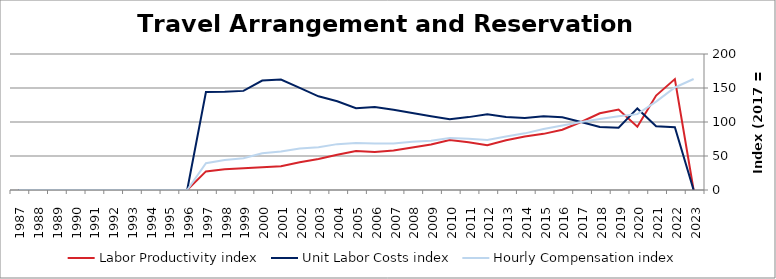
| Category | Labor Productivity index | Unit Labor Costs index | Hourly Compensation index |
|---|---|---|---|
| 2023.0 | 0 | 0 | 163.231 |
| 2022.0 | 163.071 | 92.446 | 150.753 |
| 2021.0 | 138.811 | 93.658 | 130.007 |
| 2020.0 | 92.969 | 119.975 | 111.539 |
| 2019.0 | 118.233 | 91.633 | 108.34 |
| 2018.0 | 112.78 | 92.608 | 104.444 |
| 2017.0 | 100 | 100 | 100 |
| 2016.0 | 88.666 | 106.846 | 94.735 |
| 2015.0 | 82.556 | 108.479 | 89.556 |
| 2014.0 | 78.749 | 105.789 | 83.308 |
| 2013.0 | 73.19 | 107.402 | 78.608 |
| 2012.0 | 65.942 | 111.278 | 73.379 |
| 2011.0 | 70.225 | 107.181 | 75.268 |
| 2010.0 | 73.42 | 104.143 | 76.462 |
| 2009.0 | 66.896 | 108.481 | 72.57 |
| 2008.0 | 62.524 | 113.28 | 70.826 |
| 2007.0 | 58.157 | 117.896 | 68.565 |
| 2006.0 | 56.029 | 122.043 | 68.379 |
| 2005.0 | 57.455 | 120.292 | 69.114 |
| 2004.0 | 51.716 | 130.444 | 67.46 |
| 2003.0 | 45.706 | 137.761 | 62.964 |
| 2002.0 | 40.72 | 150.277 | 61.193 |
| 2001.0 | 34.818 | 162.473 | 56.569 |
| 2000.0 | 33.495 | 160.895 | 53.892 |
| 1999.0 | 32.101 | 145.771 | 46.794 |
| 1998.0 | 30.409 | 144.525 | 43.948 |
| 1997.0 | 27.372 | 144.072 | 39.435 |
| 1996.0 | 0 | 0 | 0 |
| 1995.0 | 0 | 0 | 0 |
| 1994.0 | 0 | 0 | 0 |
| 1993.0 | 0 | 0 | 0 |
| 1992.0 | 0 | 0 | 0 |
| 1991.0 | 0 | 0 | 0 |
| 1990.0 | 0 | 0 | 0 |
| 1989.0 | 0 | 0 | 0 |
| 1988.0 | 0 | 0 | 0 |
| 1987.0 | 0 | 0 | 0 |